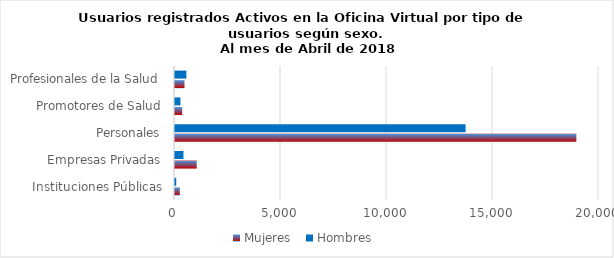
| Category | Mujeres | Hombres |
|---|---|---|
| Instituciones Públicas | 227 | 58 |
| Empresas Privadas | 1024 | 399 |
| Personales | 18932 | 13706 |
| Promotores de Salud | 339 | 257 |
| Profesionales de la Salud | 448 | 536 |